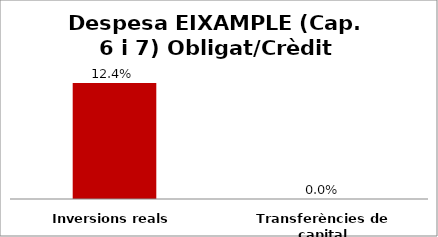
| Category | Series 0 |
|---|---|
| Inversions reals | 0.124 |
| Transferències de capital | 0 |